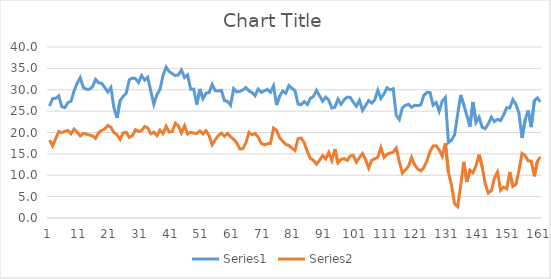
| Category | Series 0 | Series 1 |
|---|---|---|
| 0 | 26.19 | 18.22 |
| 1 | 27.91 | 16.87 |
| 2 | 27.99 | 18.52 |
| 3 | 28.57 | 20.25 |
| 4 | 26.03 | 19.97 |
| 5 | 25.82 | 20.25 |
| 6 | 26.99 | 20.49 |
| 7 | 27.31 | 19.69 |
| 8 | 29.76 | 20.79 |
| 9 | 31.52 | 20.06 |
| 10 | 32.84 | 19.19 |
| 11 | 30.55 | 19.79 |
| 12 | 30.09 | 19.61 |
| 13 | 30.14 | 19.41 |
| 14 | 30.7 | 19.25 |
| 15 | 32.42 | 18.62 |
| 16 | 31.6 | 19.98 |
| 17 | 31.5 | 20.46 |
| 18 | 30.53 | 20.86 |
| 19 | 29.47 | 21.64 |
| 20 | 30.52 | 21.23 |
| 21 | 25.74 | 19.96 |
| 22 | 23.44 | 19.45 |
| 23 | 27.47 | 18.37 |
| 24 | 28.46 | 19.92 |
| 25 | 29.21 | 20.06 |
| 26 | 32.33 | 18.84 |
| 27 | 32.73 | 19.25 |
| 28 | 32.62 | 20.67 |
| 29 | 31.7 | 20.24 |
| 30 | 33.33 | 20.42 |
| 31 | 32.23 | 21.39 |
| 32 | 32.93 | 21.05 |
| 33 | 29.66 | 19.7 |
| 34 | 26.59 | 20.09 |
| 35 | 28.86 | 19.28 |
| 36 | 30.06 | 20.56 |
| 37 | 33.4 | 19.74 |
| 38 | 35.29 | 21.47 |
| 39 | 34.26 | 20.09 |
| 40 | 33.74 | 20.25 |
| 41 | 33.34 | 22.19 |
| 42 | 33.48 | 21.55 |
| 43 | 34.61 | 19.87 |
| 44 | 32.85 | 21.6 |
| 45 | 33.46 | 19.65 |
| 46 | 30.09 | 20.06 |
| 47 | 30.15 | 19.87 |
| 48 | 26.54 | 19.72 |
| 49 | 30.17 | 20.39 |
| 50 | 27.93 | 19.67 |
| 51 | 29.2 | 20.42 |
| 52 | 29.34 | 19.25 |
| 53 | 31.26 | 17.1 |
| 54 | 29.81 | 18.29 |
| 55 | 29.71 | 19.27 |
| 56 | 29.84 | 19.87 |
| 57 | 27.46 | 19.16 |
| 58 | 27.31 | 19.79 |
| 59 | 26.38 | 19.01 |
| 60 | 30.25 | 18.42 |
| 61 | 29.51 | 17.61 |
| 62 | 29.61 | 16.2 |
| 63 | 29.95 | 16.18 |
| 64 | 30.52 | 17.59 |
| 65 | 29.72 | 20.04 |
| 66 | 29.33 | 19.47 |
| 67 | 28.6 | 19.78 |
| 68 | 30.18 | 18.93 |
| 69 | 29.38 | 17.46 |
| 70 | 29.72 | 17.12 |
| 71 | 30.08 | 17.39 |
| 72 | 29.4 | 17.44 |
| 73 | 30.94 | 21.03 |
| 74 | 26.41 | 20.48 |
| 75 | 28.51 | 18.78 |
| 76 | 29.68 | 17.96 |
| 77 | 29.19 | 17.2 |
| 78 | 30.98 | 16.99 |
| 79 | 30.34 | 16.32 |
| 80 | 29.79 | 15.79 |
| 81 | 26.66 | 18.56 |
| 82 | 26.49 | 18.7 |
| 83 | 27.24 | 17.63 |
| 84 | 26.53 | 15.59 |
| 85 | 28 | 13.93 |
| 86 | 28.39 | 13.51 |
| 87 | 29.85 | 12.59 |
| 88 | 28.59 | 13.49 |
| 89 | 27.31 | 14.59 |
| 90 | 28.26 | 13.82 |
| 91 | 27.56 | 15.34 |
| 92 | 25.73 | 13.44 |
| 93 | 25.91 | 16.12 |
| 94 | 27.81 | 12.89 |
| 95 | 26.6 | 13.71 |
| 96 | 27.64 | 13.89 |
| 97 | 28.27 | 13.47 |
| 98 | 28.18 | 14.5 |
| 99 | 27.09 | 14.63 |
| 100 | 26.14 | 13.07 |
| 101 | 27.52 | 14.11 |
| 102 | 25.18 | 15.08 |
| 103 | 26.29 | 13.71 |
| 104 | 27.48 | 11.68 |
| 105 | 26.88 | 13.52 |
| 106 | 27.64 | 13.84 |
| 107 | 29.88 | 14.25 |
| 108 | 27.95 | 16.47 |
| 109 | 29.04 | 14.22 |
| 110 | 30.44 | 14.95 |
| 111 | 29.96 | 15.18 |
| 112 | 30.25 | 15.4 |
| 113 | 24 | 16.37 |
| 114 | 23.03 | 13.17 |
| 115 | 25.8 | 10.5 |
| 116 | 26.37 | 11.28 |
| 117 | 26.6 | 12.11 |
| 118 | 25.89 | 14.17 |
| 119 | 26.37 | 12.44 |
| 120 | 26.28 | 11.48 |
| 121 | 26.48 | 11.02 |
| 122 | 28.71 | 11.84 |
| 123 | 29.39 | 13.4 |
| 124 | 29.37 | 15.52 |
| 125 | 26.41 | 16.83 |
| 126 | 27.01 | 16.91 |
| 127 | 24.96 | 15.97 |
| 128 | 27.35 | 14.43 |
| 129 | 28.19 | 17.53 |
| 130 | 17.64 | 10.75 |
| 131 | 18.21 | 7.71 |
| 132 | 19.47 | 3.364 |
| 133 | 24.18 | 2.68 |
| 134 | 28.78 | 7.59 |
| 135 | 26.5 | 13.12 |
| 136 | 24 | 8.43 |
| 137 | 21.33 | 11.2 |
| 138 | 27.14 | 10.58 |
| 139 | 22.36 | 12.28 |
| 140 | 23.56 | 14.87 |
| 141 | 21.24 | 12.01 |
| 142 | 20.91 | 7.96 |
| 143 | 22.04 | 5.845 |
| 144 | 23.58 | 6.431 |
| 145 | 22.55 | 9.36 |
| 146 | 23.08 | 10.77 |
| 147 | 22.77 | 6.459 |
| 148 | 24.14 | 7.22 |
| 149 | 25.82 | 6.838 |
| 150 | 25.75 | 10.76 |
| 151 | 27.71 | 7.41 |
| 152 | 26.6 | 7.86 |
| 153 | 24.47 | 11.17 |
| 154 | 18.71 | 15.1 |
| 155 | 22.95 | 14.63 |
| 156 | 25.14 | 13.38 |
| 157 | 21.26 | 13.31 |
| 158 | 27.44 | 9.75 |
| 159 | 28.08 | 13.29 |
| 160 | 27.16 | 14.29 |